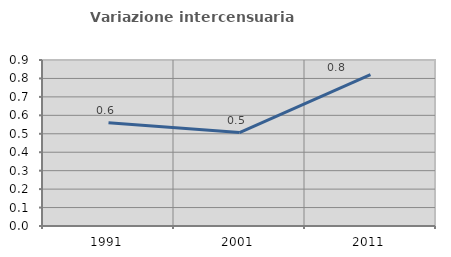
| Category | Variazione intercensuaria annua |
|---|---|
| 1991.0 | 0.56 |
| 2001.0 | 0.506 |
| 2011.0 | 0.821 |